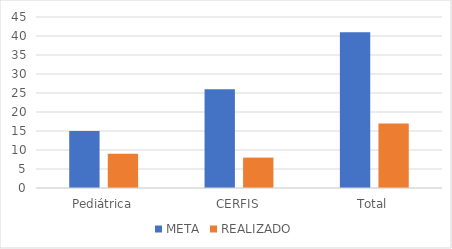
| Category | META | REALIZADO |
|---|---|---|
| Pediátrica | 15 | 9 |
| CERFIS | 26 | 8 |
| Total | 41 | 17 |